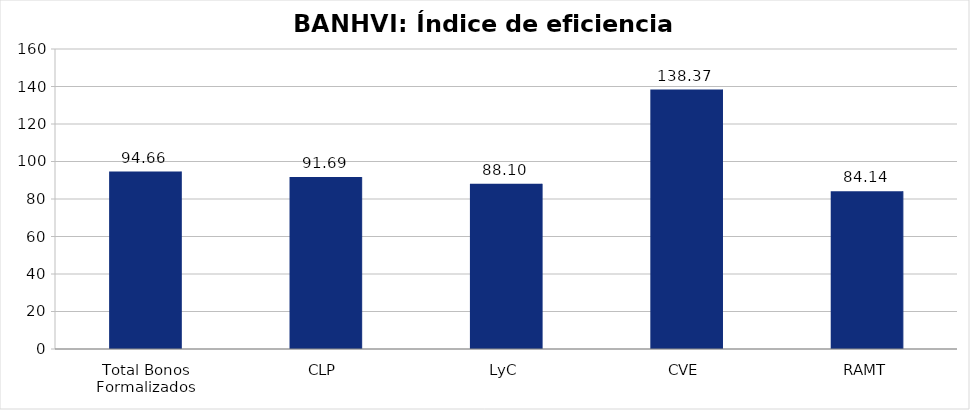
| Category | Índice de eficiencia (IE)  |
|---|---|
| Total Bonos Formalizados | 94.657 |
| CLP | 91.694 |
| LyC | 88.102 |
| CVE | 138.373 |
| RAMT | 84.135 |